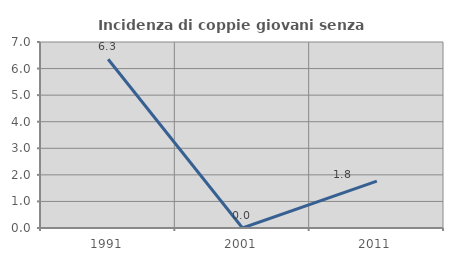
| Category | Incidenza di coppie giovani senza figli |
|---|---|
| 1991.0 | 6.349 |
| 2001.0 | 0 |
| 2011.0 | 1.762 |